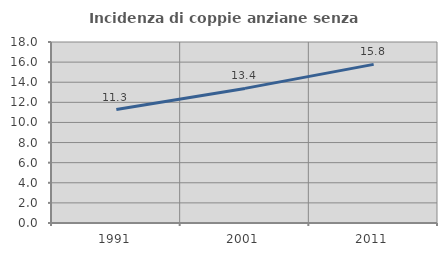
| Category | Incidenza di coppie anziane senza figli  |
|---|---|
| 1991.0 | 11.278 |
| 2001.0 | 13.386 |
| 2011.0 | 15.775 |